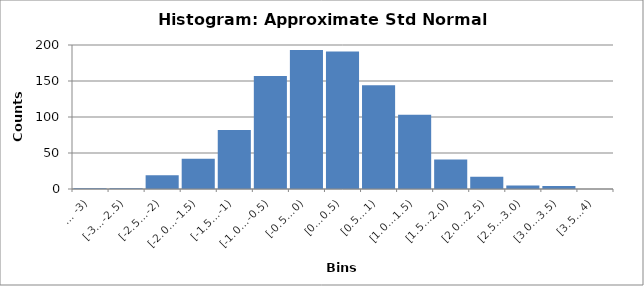
| Category | Series 0 |
|---|---|
|   … -3) | 1 |
| [-3…-2.5) | 1 |
| [-2.5…-2) | 19 |
| [-2.0…-1.5) | 42 |
| [-1.5…-1) | 82 |
| [-1.0…-0.5) | 157 |
| [-0.5…0) | 193 |
| [0…0.5) | 191 |
| [0.5…1) | 144 |
| [1.0…1.5) | 103 |
| [1.5…2.0) | 41 |
| [2.0…2.5) | 17 |
| [2.5…3.0) | 5 |
| [3.0…3.5) | 4 |
| [3.5…4) | 0 |